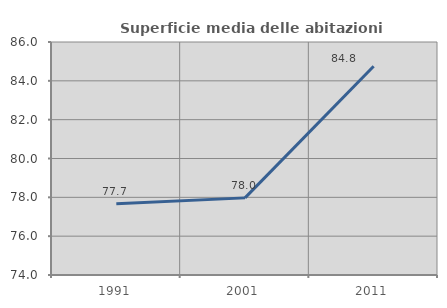
| Category | Superficie media delle abitazioni occupate |
|---|---|
| 1991.0 | 77.67 |
| 2001.0 | 77.972 |
| 2011.0 | 84.753 |